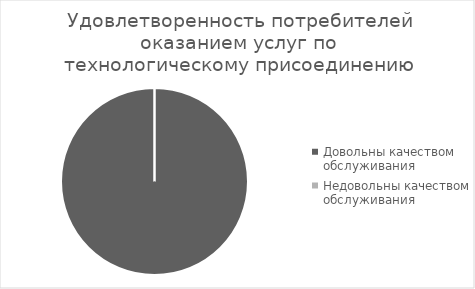
| Category | Удовлетворенность потребителей оказанием услуг по технологическому присоединению |
|---|---|
| Довольны качеством обслуживания | 100 |
| Недовольны качеством обслуживания | 0 |